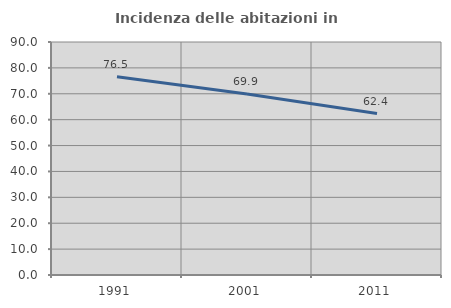
| Category | Incidenza delle abitazioni in proprietà  |
|---|---|
| 1991.0 | 76.54 |
| 2001.0 | 69.912 |
| 2011.0 | 62.356 |